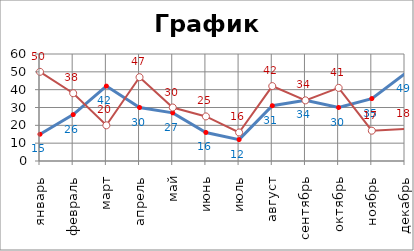
| Category | Филиал1 | Филиал2 |
|---|---|---|
| январь | 15 | 50 |
| февраль | 26 | 38 |
| март | 42 | 20 |
| апрель | 30 | 47 |
| май | 27 | 30 |
| июнь | 16 | 25 |
| июль | 12 | 16 |
| август | 31 | 42 |
| сентябрь | 34 | 34 |
| октябрь | 30 | 41 |
| ноябрь | 35 | 17 |
| декабрь | 49 | 18 |